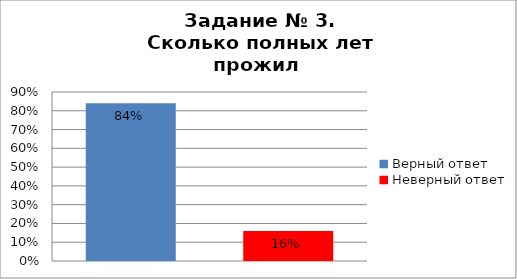
| Category | Сколько полных лет прожил Н.И. Лобачевский? |
|---|---|
| Верный ответ | 0.84 |
| Неверный ответ | 0.16 |